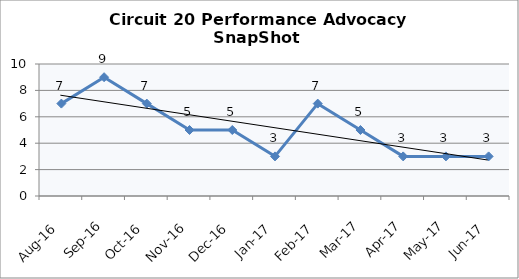
| Category | Circuit 20 |
|---|---|
| Aug-16 | 7 |
| Sep-16 | 9 |
| Oct-16 | 7 |
| Nov-16 | 5 |
| Dec-16 | 5 |
| Jan-17 | 3 |
| Feb-17 | 7 |
| Mar-17 | 5 |
| Apr-17 | 3 |
| May-17 | 3 |
| Jun-17 | 3 |